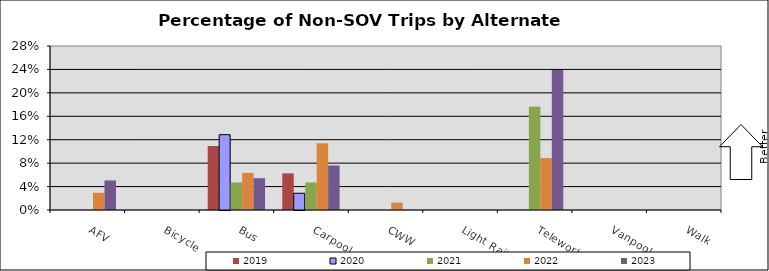
| Category | 2019 | 2020 | 2021 | 2022 | 2023 |
|---|---|---|---|---|---|
| AFV | 0 | 0 | 0 | 0.029 | 0.05 |
| Bicycle | 0 | 0 | 0 | 0 | 0 |
| Bus | 0.109 | 0.129 | 0.047 | 0.063 | 0.054 |
| Carpool | 0.062 | 0.029 | 0.047 | 0.114 | 0.076 |
| CWW | 0 | 0 | 0 | 0.013 | 0 |
| Light Rail | 0 | 0 | 0 | 0 | 0 |
| Telework | 0 | 0 | 0.176 | 0.089 | 0.239 |
| Vanpool | 0 | 0 | 0 | 0 | 0 |
| Walk | 0 | 0 | 0 | 0 | 0 |